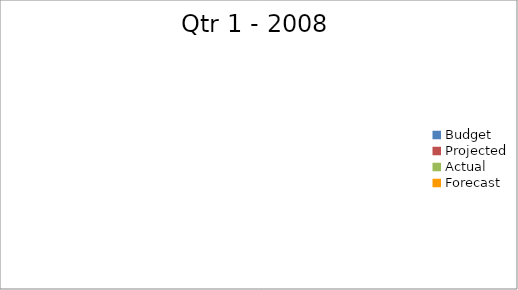
| Category | Series 0 |
|---|---|
| Budget | 2790 |
| Projected | 2430 |
| Actual | 1280 |
| Forecast | 1880 |